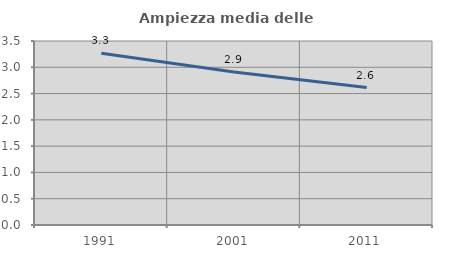
| Category | Ampiezza media delle famiglie |
|---|---|
| 1991.0 | 3.266 |
| 2001.0 | 2.911 |
| 2011.0 | 2.614 |